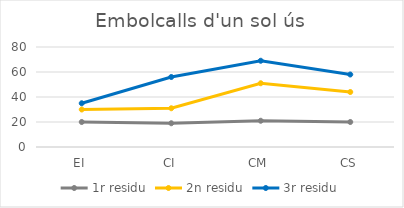
| Category | 1r residu | 2n residu | 3r residu |
|---|---|---|---|
| EI | 20 | 10 | 5 |
| CI | 19 | 12 | 25 |
| CM | 21 | 30 | 18 |
| CS | 20 | 24 | 14 |